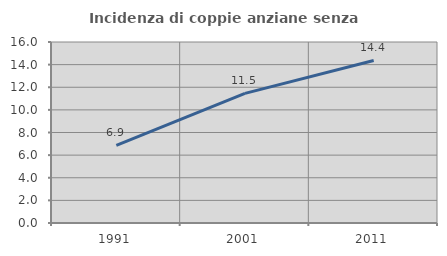
| Category | Incidenza di coppie anziane senza figli  |
|---|---|
| 1991.0 | 6.861 |
| 2001.0 | 11.457 |
| 2011.0 | 14.369 |